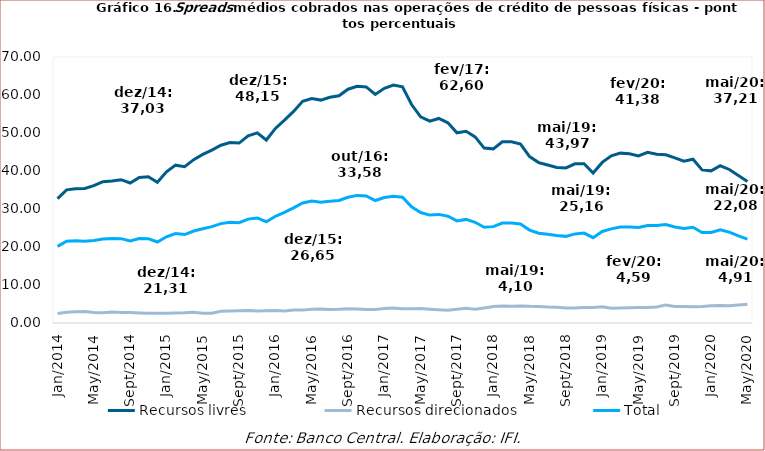
| Category | Recursos livres | Recursos direcionados | Total |
|---|---|---|---|
| 2014-01-01 | 32.74 | 2.49 | 20.17 |
| 2014-02-01 | 35.05 | 2.84 | 21.51 |
| 2014-03-01 | 35.33 | 2.94 | 21.63 |
| 2014-04-01 | 35.39 | 3.02 | 21.54 |
| 2014-05-01 | 36.13 | 2.75 | 21.71 |
| 2014-06-01 | 37.19 | 2.67 | 22.11 |
| 2014-07-01 | 37.38 | 2.91 | 22.21 |
| 2014-08-01 | 37.71 | 2.79 | 22.2 |
| 2014-09-01 | 36.84 | 2.76 | 21.59 |
| 2014-10-01 | 38.31 | 2.65 | 22.25 |
| 2014-11-01 | 38.5 | 2.56 | 22.2 |
| 2014-12-01 | 37.03 | 2.55 | 21.31 |
| 2015-01-01 | 39.79 | 2.54 | 22.69 |
| 2015-02-01 | 41.54 | 2.62 | 23.54 |
| 2015-03-01 | 41.14 | 2.7 | 23.28 |
| 2015-04-01 | 42.99 | 2.85 | 24.21 |
| 2015-05-01 | 44.38 | 2.54 | 24.8 |
| 2015-06-01 | 45.51 | 2.59 | 25.35 |
| 2015-07-01 | 46.78 | 3.07 | 26.16 |
| 2015-08-01 | 47.49 | 3.19 | 26.5 |
| 2015-09-01 | 47.35 | 3.24 | 26.38 |
| 2015-10-01 | 49.27 | 3.3 | 27.34 |
| 2015-11-01 | 50.02 | 3.15 | 27.64 |
| 2015-12-01 | 48.15 | 3.24 | 26.65 |
| 2016-01-01 | 51.21 | 3.29 | 28.09 |
| 2016-02-01 | 53.39 | 3.16 | 29.1 |
| 2016-03-01 | 55.68 | 3.42 | 30.29 |
| 2016-04-01 | 58.34 | 3.39 | 31.57 |
| 2016-05-01 | 59.07 | 3.64 | 32.09 |
| 2016-06-01 | 58.66 | 3.66 | 31.76 |
| 2016-07-01 | 59.4 | 3.55 | 32.01 |
| 2016-08-01 | 59.8 | 3.62 | 32.25 |
| 2016-09-01 | 61.52 | 3.76 | 33.1 |
| 2016-10-01 | 62.28 | 3.7 | 33.58 |
| 2016-11-01 | 62.13 | 3.53 | 33.42 |
| 2016-12-01 | 60.15 | 3.54 | 32.23 |
| 2017-01-01 | 61.76 | 3.81 | 33.02 |
| 2017-02-01 | 62.6 | 3.93 | 33.35 |
| 2017-03-01 | 62.17 | 3.78 | 33.08 |
| 2017-04-01 | 57.49 | 3.73 | 30.57 |
| 2017-05-01 | 54.25 | 3.84 | 29.08 |
| 2017-06-01 | 53.1 | 3.63 | 28.4 |
| 2017-07-01 | 53.83 | 3.46 | 28.58 |
| 2017-08-01 | 52.69 | 3.37 | 28.09 |
| 2017-09-01 | 50.05 | 3.64 | 26.87 |
| 2017-10-01 | 50.45 | 3.87 | 27.26 |
| 2017-11-01 | 48.98 | 3.62 | 26.51 |
| 2017-12-01 | 46.03 | 3.95 | 25.19 |
| 2018-01-01 | 45.83 | 4.36 | 25.36 |
| 2018-02-01 | 47.69 | 4.45 | 26.3 |
| 2018-03-01 | 47.68 | 4.41 | 26.29 |
| 2018-04-01 | 47.09 | 4.48 | 26.08 |
| 2018-05-01 | 43.79 | 4.38 | 24.45 |
| 2018-06-01 | 42.21 | 4.35 | 23.62 |
| 2018-07-01 | 41.59 | 4.21 | 23.34 |
| 2018-08-01 | 40.91 | 4.14 | 23.01 |
| 2018-09-01 | 40.82 | 3.93 | 22.8 |
| 2018-10-01 | 41.88 | 3.97 | 23.45 |
| 2018-11-01 | 41.93 | 4.06 | 23.67 |
| 2018-12-01 | 39.45 | 4.1 | 22.46 |
| 2019-01-01 | 42.26 | 4.3 | 24.09 |
| 2019-02-01 | 44.01 | 3.87 | 24.78 |
| 2019-03-01 | 44.7 | 3.94 | 25.24 |
| 2019-04-01 | 44.53 | 4.03 | 25.26 |
| 2019-05-01 | 43.97 | 4.1 | 25.16 |
| 2019-06-01 | 44.9 | 4.08 | 25.66 |
| 2019-07-01 | 44.43 | 4.19 | 25.63 |
| 2019-08-01 | 44.27 | 4.76 | 25.89 |
| 2019-09-01 | 43.45 | 4.32 | 25.28 |
| 2019-10-01 | 42.59 | 4.31 | 24.85 |
| 2019-11-01 | 43.1 | 4.25 | 25.21 |
| 2019-12-01 | 40.29 | 4.37 | 23.83 |
| 2020-01-01 | 40.04 | 4.55 | 23.81 |
| 2020-02-01 | 41.38 | 4.59 | 24.55 |
| 2020-03-01 | 40.4 | 4.56 | 23.92 |
| 2020-04-01 | 38.82 | 4.76 | 22.91 |
| 2020-05-01 | 37.21 | 4.91 | 22.08 |